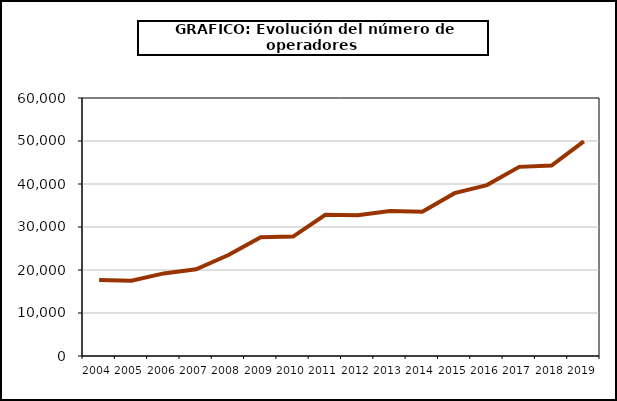
| Category | Operadores (*) |
|---|---|
| 2004.0 | 17688 |
| 2005.0 | 17509 |
| 2006.0 | 19211 |
| 2007.0 | 20171 |
| 2008.0 | 23473 |
| 2009.0 | 27627 |
| 2010.0 | 27767 |
| 2011.0 | 32837 |
| 2012.0 | 32724 |
| 2013.0 | 33704 |
| 2014.0 | 33539 |
| 2015.0 | 37870 |
| 2016.0 | 39744 |
| 2017.0 | 43984 |
| 2018.0 | 44282 |
| 2019.0 | 49918 |